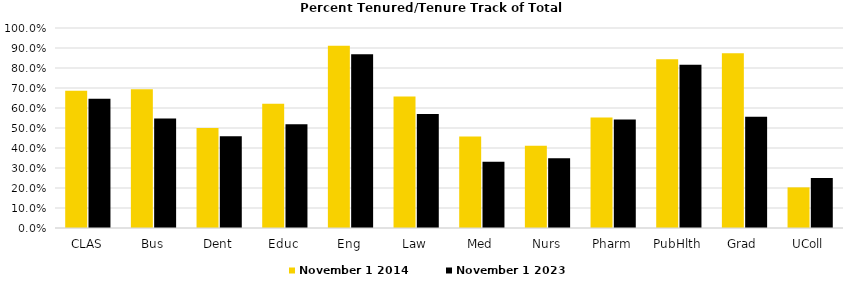
| Category | November 1 2014 | November 1 2023 |
|---|---|---|
| CLAS | 0.686 | 0.646 |
| Bus | 0.694 | 0.547 |
| Dent | 0.5 | 0.459 |
| Educ | 0.621 | 0.519 |
| Eng | 0.911 | 0.869 |
| Law | 0.658 | 0.57 |
| Med | 0.457 | 0.331 |
| Nurs | 0.411 | 0.348 |
| Pharm | 0.553 | 0.542 |
| PubHlth | 0.844 | 0.816 |
| Grad | 0.874 | 0.556 |
| UColl | 0.203 | 0.25 |